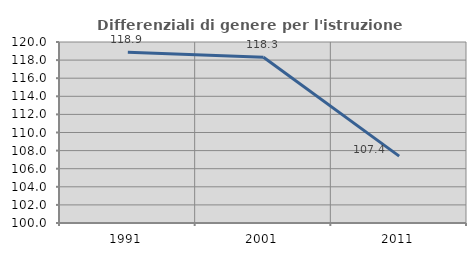
| Category | Differenziali di genere per l'istruzione superiore |
|---|---|
| 1991.0 | 118.857 |
| 2001.0 | 118.314 |
| 2011.0 | 107.389 |